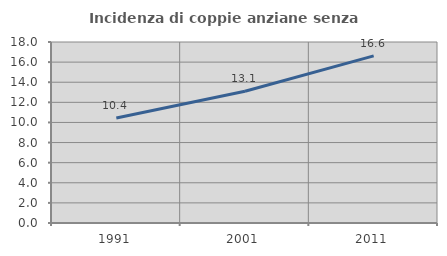
| Category | Incidenza di coppie anziane senza figli  |
|---|---|
| 1991.0 | 10.439 |
| 2001.0 | 13.108 |
| 2011.0 | 16.616 |